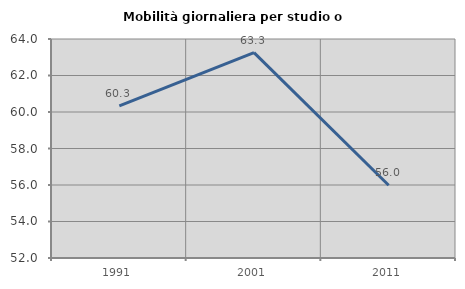
| Category | Mobilità giornaliera per studio o lavoro |
|---|---|
| 1991.0 | 60.334 |
| 2001.0 | 63.255 |
| 2011.0 | 55.989 |